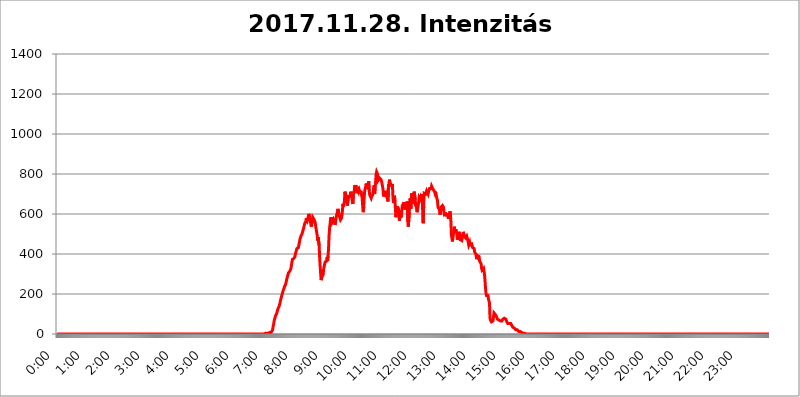
| Category | 2017.11.28. Intenzitás [W/m^2] |
|---|---|
| 0.0 | 0 |
| 0.0006944444444444445 | 0 |
| 0.001388888888888889 | 0 |
| 0.0020833333333333333 | 0 |
| 0.002777777777777778 | 0 |
| 0.003472222222222222 | 0 |
| 0.004166666666666667 | 0 |
| 0.004861111111111111 | 0 |
| 0.005555555555555556 | 0 |
| 0.0062499999999999995 | 0 |
| 0.006944444444444444 | 0 |
| 0.007638888888888889 | 0 |
| 0.008333333333333333 | 0 |
| 0.009027777777777779 | 0 |
| 0.009722222222222222 | 0 |
| 0.010416666666666666 | 0 |
| 0.011111111111111112 | 0 |
| 0.011805555555555555 | 0 |
| 0.012499999999999999 | 0 |
| 0.013194444444444444 | 0 |
| 0.013888888888888888 | 0 |
| 0.014583333333333332 | 0 |
| 0.015277777777777777 | 0 |
| 0.015972222222222224 | 0 |
| 0.016666666666666666 | 0 |
| 0.017361111111111112 | 0 |
| 0.018055555555555557 | 0 |
| 0.01875 | 0 |
| 0.019444444444444445 | 0 |
| 0.02013888888888889 | 0 |
| 0.020833333333333332 | 0 |
| 0.02152777777777778 | 0 |
| 0.022222222222222223 | 0 |
| 0.02291666666666667 | 0 |
| 0.02361111111111111 | 0 |
| 0.024305555555555556 | 0 |
| 0.024999999999999998 | 0 |
| 0.025694444444444447 | 0 |
| 0.02638888888888889 | 0 |
| 0.027083333333333334 | 0 |
| 0.027777777777777776 | 0 |
| 0.02847222222222222 | 0 |
| 0.029166666666666664 | 0 |
| 0.029861111111111113 | 0 |
| 0.030555555555555555 | 0 |
| 0.03125 | 0 |
| 0.03194444444444445 | 0 |
| 0.03263888888888889 | 0 |
| 0.03333333333333333 | 0 |
| 0.034027777777777775 | 0 |
| 0.034722222222222224 | 0 |
| 0.035416666666666666 | 0 |
| 0.036111111111111115 | 0 |
| 0.03680555555555556 | 0 |
| 0.0375 | 0 |
| 0.03819444444444444 | 0 |
| 0.03888888888888889 | 0 |
| 0.03958333333333333 | 0 |
| 0.04027777777777778 | 0 |
| 0.04097222222222222 | 0 |
| 0.041666666666666664 | 0 |
| 0.042361111111111106 | 0 |
| 0.04305555555555556 | 0 |
| 0.043750000000000004 | 0 |
| 0.044444444444444446 | 0 |
| 0.04513888888888889 | 0 |
| 0.04583333333333334 | 0 |
| 0.04652777777777778 | 0 |
| 0.04722222222222222 | 0 |
| 0.04791666666666666 | 0 |
| 0.04861111111111111 | 0 |
| 0.049305555555555554 | 0 |
| 0.049999999999999996 | 0 |
| 0.05069444444444445 | 0 |
| 0.051388888888888894 | 0 |
| 0.052083333333333336 | 0 |
| 0.05277777777777778 | 0 |
| 0.05347222222222222 | 0 |
| 0.05416666666666667 | 0 |
| 0.05486111111111111 | 0 |
| 0.05555555555555555 | 0 |
| 0.05625 | 0 |
| 0.05694444444444444 | 0 |
| 0.057638888888888885 | 0 |
| 0.05833333333333333 | 0 |
| 0.05902777777777778 | 0 |
| 0.059722222222222225 | 0 |
| 0.06041666666666667 | 0 |
| 0.061111111111111116 | 0 |
| 0.06180555555555556 | 0 |
| 0.0625 | 0 |
| 0.06319444444444444 | 0 |
| 0.06388888888888888 | 0 |
| 0.06458333333333334 | 0 |
| 0.06527777777777778 | 0 |
| 0.06597222222222222 | 0 |
| 0.06666666666666667 | 0 |
| 0.06736111111111111 | 0 |
| 0.06805555555555555 | 0 |
| 0.06874999999999999 | 0 |
| 0.06944444444444443 | 0 |
| 0.07013888888888889 | 0 |
| 0.07083333333333333 | 0 |
| 0.07152777777777779 | 0 |
| 0.07222222222222223 | 0 |
| 0.07291666666666667 | 0 |
| 0.07361111111111111 | 0 |
| 0.07430555555555556 | 0 |
| 0.075 | 0 |
| 0.07569444444444444 | 0 |
| 0.0763888888888889 | 0 |
| 0.07708333333333334 | 0 |
| 0.07777777777777778 | 0 |
| 0.07847222222222222 | 0 |
| 0.07916666666666666 | 0 |
| 0.0798611111111111 | 0 |
| 0.08055555555555556 | 0 |
| 0.08125 | 0 |
| 0.08194444444444444 | 0 |
| 0.08263888888888889 | 0 |
| 0.08333333333333333 | 0 |
| 0.08402777777777777 | 0 |
| 0.08472222222222221 | 0 |
| 0.08541666666666665 | 0 |
| 0.08611111111111112 | 0 |
| 0.08680555555555557 | 0 |
| 0.08750000000000001 | 0 |
| 0.08819444444444445 | 0 |
| 0.08888888888888889 | 0 |
| 0.08958333333333333 | 0 |
| 0.09027777777777778 | 0 |
| 0.09097222222222222 | 0 |
| 0.09166666666666667 | 0 |
| 0.09236111111111112 | 0 |
| 0.09305555555555556 | 0 |
| 0.09375 | 0 |
| 0.09444444444444444 | 0 |
| 0.09513888888888888 | 0 |
| 0.09583333333333333 | 0 |
| 0.09652777777777777 | 0 |
| 0.09722222222222222 | 0 |
| 0.09791666666666667 | 0 |
| 0.09861111111111111 | 0 |
| 0.09930555555555555 | 0 |
| 0.09999999999999999 | 0 |
| 0.10069444444444443 | 0 |
| 0.1013888888888889 | 0 |
| 0.10208333333333335 | 0 |
| 0.10277777777777779 | 0 |
| 0.10347222222222223 | 0 |
| 0.10416666666666667 | 0 |
| 0.10486111111111111 | 0 |
| 0.10555555555555556 | 0 |
| 0.10625 | 0 |
| 0.10694444444444444 | 0 |
| 0.1076388888888889 | 0 |
| 0.10833333333333334 | 0 |
| 0.10902777777777778 | 0 |
| 0.10972222222222222 | 0 |
| 0.1111111111111111 | 0 |
| 0.11180555555555556 | 0 |
| 0.11180555555555556 | 0 |
| 0.1125 | 0 |
| 0.11319444444444444 | 0 |
| 0.11388888888888889 | 0 |
| 0.11458333333333333 | 0 |
| 0.11527777777777777 | 0 |
| 0.11597222222222221 | 0 |
| 0.11666666666666665 | 0 |
| 0.1173611111111111 | 0 |
| 0.11805555555555557 | 0 |
| 0.11944444444444445 | 0 |
| 0.12013888888888889 | 0 |
| 0.12083333333333333 | 0 |
| 0.12152777777777778 | 0 |
| 0.12222222222222223 | 0 |
| 0.12291666666666667 | 0 |
| 0.12291666666666667 | 0 |
| 0.12361111111111112 | 0 |
| 0.12430555555555556 | 0 |
| 0.125 | 0 |
| 0.12569444444444444 | 0 |
| 0.12638888888888888 | 0 |
| 0.12708333333333333 | 0 |
| 0.16875 | 0 |
| 0.12847222222222224 | 0 |
| 0.12916666666666668 | 0 |
| 0.12986111111111112 | 0 |
| 0.13055555555555556 | 0 |
| 0.13125 | 0 |
| 0.13194444444444445 | 0 |
| 0.1326388888888889 | 0 |
| 0.13333333333333333 | 0 |
| 0.13402777777777777 | 0 |
| 0.13402777777777777 | 0 |
| 0.13472222222222222 | 0 |
| 0.13541666666666666 | 0 |
| 0.1361111111111111 | 0 |
| 0.13749999999999998 | 0 |
| 0.13819444444444443 | 0 |
| 0.1388888888888889 | 0 |
| 0.13958333333333334 | 0 |
| 0.14027777777777778 | 0 |
| 0.14097222222222222 | 0 |
| 0.14166666666666666 | 0 |
| 0.1423611111111111 | 0 |
| 0.14305555555555557 | 0 |
| 0.14375000000000002 | 0 |
| 0.14444444444444446 | 0 |
| 0.1451388888888889 | 0 |
| 0.1451388888888889 | 0 |
| 0.14652777777777778 | 0 |
| 0.14722222222222223 | 0 |
| 0.14791666666666667 | 0 |
| 0.1486111111111111 | 0 |
| 0.14930555555555555 | 0 |
| 0.15 | 0 |
| 0.15069444444444444 | 0 |
| 0.15138888888888888 | 0 |
| 0.15208333333333332 | 0 |
| 0.15277777777777776 | 0 |
| 0.15347222222222223 | 0 |
| 0.15416666666666667 | 0 |
| 0.15486111111111112 | 0 |
| 0.15555555555555556 | 0 |
| 0.15625 | 0 |
| 0.15694444444444444 | 0 |
| 0.15763888888888888 | 0 |
| 0.15833333333333333 | 0 |
| 0.15902777777777777 | 0 |
| 0.15972222222222224 | 0 |
| 0.16041666666666668 | 0 |
| 0.16111111111111112 | 0 |
| 0.16180555555555556 | 0 |
| 0.1625 | 0 |
| 0.16319444444444445 | 0 |
| 0.1638888888888889 | 0 |
| 0.16458333333333333 | 0 |
| 0.16527777777777777 | 0 |
| 0.16597222222222222 | 0 |
| 0.16666666666666666 | 0 |
| 0.1673611111111111 | 0 |
| 0.16805555555555554 | 0 |
| 0.16874999999999998 | 0 |
| 0.16944444444444443 | 0 |
| 0.17013888888888887 | 0 |
| 0.1708333333333333 | 0 |
| 0.17152777777777775 | 0 |
| 0.17222222222222225 | 0 |
| 0.1729166666666667 | 0 |
| 0.17361111111111113 | 0 |
| 0.17430555555555557 | 0 |
| 0.17500000000000002 | 0 |
| 0.17569444444444446 | 0 |
| 0.1763888888888889 | 0 |
| 0.17708333333333334 | 0 |
| 0.17777777777777778 | 0 |
| 0.17847222222222223 | 0 |
| 0.17916666666666667 | 0 |
| 0.1798611111111111 | 0 |
| 0.18055555555555555 | 0 |
| 0.18125 | 0 |
| 0.18194444444444444 | 0 |
| 0.1826388888888889 | 0 |
| 0.18333333333333335 | 0 |
| 0.1840277777777778 | 0 |
| 0.18472222222222223 | 0 |
| 0.18541666666666667 | 0 |
| 0.18611111111111112 | 0 |
| 0.18680555555555556 | 0 |
| 0.1875 | 0 |
| 0.18819444444444444 | 0 |
| 0.18888888888888888 | 0 |
| 0.18958333333333333 | 0 |
| 0.19027777777777777 | 0 |
| 0.1909722222222222 | 0 |
| 0.19166666666666665 | 0 |
| 0.19236111111111112 | 0 |
| 0.19305555555555554 | 0 |
| 0.19375 | 0 |
| 0.19444444444444445 | 0 |
| 0.1951388888888889 | 0 |
| 0.19583333333333333 | 0 |
| 0.19652777777777777 | 0 |
| 0.19722222222222222 | 0 |
| 0.19791666666666666 | 0 |
| 0.1986111111111111 | 0 |
| 0.19930555555555554 | 0 |
| 0.19999999999999998 | 0 |
| 0.20069444444444443 | 0 |
| 0.20138888888888887 | 0 |
| 0.2020833333333333 | 0 |
| 0.2027777777777778 | 0 |
| 0.2034722222222222 | 0 |
| 0.2041666666666667 | 0 |
| 0.20486111111111113 | 0 |
| 0.20555555555555557 | 0 |
| 0.20625000000000002 | 0 |
| 0.20694444444444446 | 0 |
| 0.2076388888888889 | 0 |
| 0.20833333333333334 | 0 |
| 0.20902777777777778 | 0 |
| 0.20972222222222223 | 0 |
| 0.21041666666666667 | 0 |
| 0.2111111111111111 | 0 |
| 0.21180555555555555 | 0 |
| 0.2125 | 0 |
| 0.21319444444444444 | 0 |
| 0.2138888888888889 | 0 |
| 0.21458333333333335 | 0 |
| 0.2152777777777778 | 0 |
| 0.21597222222222223 | 0 |
| 0.21666666666666667 | 0 |
| 0.21736111111111112 | 0 |
| 0.21805555555555556 | 0 |
| 0.21875 | 0 |
| 0.21944444444444444 | 0 |
| 0.22013888888888888 | 0 |
| 0.22083333333333333 | 0 |
| 0.22152777777777777 | 0 |
| 0.2222222222222222 | 0 |
| 0.22291666666666665 | 0 |
| 0.2236111111111111 | 0 |
| 0.22430555555555556 | 0 |
| 0.225 | 0 |
| 0.22569444444444445 | 0 |
| 0.2263888888888889 | 0 |
| 0.22708333333333333 | 0 |
| 0.22777777777777777 | 0 |
| 0.22847222222222222 | 0 |
| 0.22916666666666666 | 0 |
| 0.2298611111111111 | 0 |
| 0.23055555555555554 | 0 |
| 0.23124999999999998 | 0 |
| 0.23194444444444443 | 0 |
| 0.23263888888888887 | 0 |
| 0.2333333333333333 | 0 |
| 0.2340277777777778 | 0 |
| 0.2347222222222222 | 0 |
| 0.2354166666666667 | 0 |
| 0.23611111111111113 | 0 |
| 0.23680555555555557 | 0 |
| 0.23750000000000002 | 0 |
| 0.23819444444444446 | 0 |
| 0.2388888888888889 | 0 |
| 0.23958333333333334 | 0 |
| 0.24027777777777778 | 0 |
| 0.24097222222222223 | 0 |
| 0.24166666666666667 | 0 |
| 0.2423611111111111 | 0 |
| 0.24305555555555555 | 0 |
| 0.24375 | 0 |
| 0.24444444444444446 | 0 |
| 0.24513888888888888 | 0 |
| 0.24583333333333335 | 0 |
| 0.2465277777777778 | 0 |
| 0.24722222222222223 | 0 |
| 0.24791666666666667 | 0 |
| 0.24861111111111112 | 0 |
| 0.24930555555555556 | 0 |
| 0.25 | 0 |
| 0.25069444444444444 | 0 |
| 0.2513888888888889 | 0 |
| 0.2520833333333333 | 0 |
| 0.25277777777777777 | 0 |
| 0.2534722222222222 | 0 |
| 0.25416666666666665 | 0 |
| 0.2548611111111111 | 0 |
| 0.2555555555555556 | 0 |
| 0.25625000000000003 | 0 |
| 0.2569444444444445 | 0 |
| 0.2576388888888889 | 0 |
| 0.25833333333333336 | 0 |
| 0.2590277777777778 | 0 |
| 0.25972222222222224 | 0 |
| 0.2604166666666667 | 0 |
| 0.2611111111111111 | 0 |
| 0.26180555555555557 | 0 |
| 0.2625 | 0 |
| 0.26319444444444445 | 0 |
| 0.2638888888888889 | 0 |
| 0.26458333333333334 | 0 |
| 0.2652777777777778 | 0 |
| 0.2659722222222222 | 0 |
| 0.26666666666666666 | 0 |
| 0.2673611111111111 | 0 |
| 0.26805555555555555 | 0 |
| 0.26875 | 0 |
| 0.26944444444444443 | 0 |
| 0.2701388888888889 | 0 |
| 0.2708333333333333 | 0 |
| 0.27152777777777776 | 0 |
| 0.2722222222222222 | 0 |
| 0.27291666666666664 | 0 |
| 0.2736111111111111 | 0 |
| 0.2743055555555555 | 0 |
| 0.27499999999999997 | 0 |
| 0.27569444444444446 | 0 |
| 0.27638888888888885 | 0 |
| 0.27708333333333335 | 0 |
| 0.2777777777777778 | 0 |
| 0.27847222222222223 | 0 |
| 0.2791666666666667 | 0 |
| 0.2798611111111111 | 0 |
| 0.28055555555555556 | 0 |
| 0.28125 | 0 |
| 0.28194444444444444 | 0 |
| 0.2826388888888889 | 0 |
| 0.2833333333333333 | 0 |
| 0.28402777777777777 | 0 |
| 0.2847222222222222 | 0 |
| 0.28541666666666665 | 0 |
| 0.28611111111111115 | 0 |
| 0.28680555555555554 | 0 |
| 0.28750000000000003 | 0 |
| 0.2881944444444445 | 0 |
| 0.2888888888888889 | 0 |
| 0.28958333333333336 | 0 |
| 0.2902777777777778 | 0 |
| 0.29097222222222224 | 3.525 |
| 0.2916666666666667 | 3.525 |
| 0.2923611111111111 | 3.525 |
| 0.29305555555555557 | 3.525 |
| 0.29375 | 3.525 |
| 0.29444444444444445 | 3.525 |
| 0.2951388888888889 | 3.525 |
| 0.29583333333333334 | 3.525 |
| 0.2965277777777778 | 3.525 |
| 0.2972222222222222 | 3.525 |
| 0.29791666666666666 | 7.887 |
| 0.2986111111111111 | 3.525 |
| 0.29930555555555555 | 7.887 |
| 0.3 | 7.887 |
| 0.30069444444444443 | 7.887 |
| 0.3013888888888889 | 12.257 |
| 0.3020833333333333 | 21.024 |
| 0.30277777777777776 | 38.653 |
| 0.3034722222222222 | 47.511 |
| 0.30416666666666664 | 65.31 |
| 0.3048611111111111 | 74.246 |
| 0.3055555555555555 | 83.205 |
| 0.30624999999999997 | 92.184 |
| 0.3069444444444444 | 96.682 |
| 0.3076388888888889 | 101.184 |
| 0.30833333333333335 | 110.201 |
| 0.3090277777777778 | 119.235 |
| 0.30972222222222223 | 128.284 |
| 0.3104166666666667 | 132.814 |
| 0.3111111111111111 | 137.347 |
| 0.31180555555555556 | 146.423 |
| 0.3125 | 155.509 |
| 0.31319444444444444 | 169.156 |
| 0.3138888888888889 | 178.264 |
| 0.3145833333333333 | 187.378 |
| 0.31527777777777777 | 191.937 |
| 0.3159722222222222 | 205.62 |
| 0.31666666666666665 | 214.746 |
| 0.31736111111111115 | 219.309 |
| 0.31805555555555554 | 228.436 |
| 0.31875000000000003 | 237.564 |
| 0.3194444444444445 | 242.127 |
| 0.3201388888888889 | 246.689 |
| 0.32083333333333336 | 255.813 |
| 0.3215277777777778 | 269.49 |
| 0.32222222222222224 | 278.603 |
| 0.3229166666666667 | 287.709 |
| 0.3236111111111111 | 296.808 |
| 0.32430555555555557 | 305.898 |
| 0.325 | 301.354 |
| 0.32569444444444445 | 305.898 |
| 0.3263888888888889 | 314.98 |
| 0.32708333333333334 | 310.44 |
| 0.3277777777777778 | 328.584 |
| 0.3284722222222222 | 328.584 |
| 0.32916666666666666 | 360.221 |
| 0.3298611111111111 | 373.729 |
| 0.33055555555555555 | 378.224 |
| 0.33125 | 378.224 |
| 0.33194444444444443 | 378.224 |
| 0.3326388888888889 | 378.224 |
| 0.3333333333333333 | 387.202 |
| 0.3340277777777778 | 400.638 |
| 0.3347222222222222 | 405.108 |
| 0.3354166666666667 | 418.492 |
| 0.3361111111111111 | 427.39 |
| 0.3368055555555556 | 422.943 |
| 0.33749999999999997 | 422.943 |
| 0.33819444444444446 | 431.833 |
| 0.33888888888888885 | 445.129 |
| 0.33958333333333335 | 440.702 |
| 0.34027777777777773 | 471.582 |
| 0.34097222222222223 | 480.356 |
| 0.3416666666666666 | 489.108 |
| 0.3423611111111111 | 493.475 |
| 0.3430555555555555 | 497.836 |
| 0.34375 | 506.542 |
| 0.3444444444444445 | 506.542 |
| 0.3451388888888889 | 523.88 |
| 0.3458333333333334 | 532.513 |
| 0.34652777777777777 | 545.416 |
| 0.34722222222222227 | 553.986 |
| 0.34791666666666665 | 553.986 |
| 0.34861111111111115 | 562.53 |
| 0.34930555555555554 | 579.542 |
| 0.35000000000000003 | 579.542 |
| 0.3506944444444444 | 566.793 |
| 0.3513888888888889 | 575.299 |
| 0.3520833333333333 | 579.542 |
| 0.3527777777777778 | 600.661 |
| 0.3534722222222222 | 596.45 |
| 0.3541666666666667 | 583.779 |
| 0.3548611111111111 | 566.793 |
| 0.35555555555555557 | 571.049 |
| 0.35625 | 536.82 |
| 0.35694444444444445 | 545.416 |
| 0.3576388888888889 | 566.793 |
| 0.35833333333333334 | 583.779 |
| 0.3590277777777778 | 588.009 |
| 0.3597222222222222 | 575.299 |
| 0.36041666666666666 | 579.542 |
| 0.3611111111111111 | 575.299 |
| 0.36180555555555555 | 558.261 |
| 0.3625 | 536.82 |
| 0.36319444444444443 | 523.88 |
| 0.3638888888888889 | 523.88 |
| 0.3645833333333333 | 493.475 |
| 0.3652777777777778 | 467.187 |
| 0.3659722222222222 | 484.735 |
| 0.3666666666666667 | 484.735 |
| 0.3673611111111111 | 440.702 |
| 0.3680555555555556 | 378.224 |
| 0.36874999999999997 | 337.639 |
| 0.36944444444444446 | 301.354 |
| 0.37013888888888885 | 269.49 |
| 0.37083333333333335 | 278.603 |
| 0.37152777777777773 | 287.709 |
| 0.37222222222222223 | 283.156 |
| 0.3729166666666666 | 296.808 |
| 0.3736111111111111 | 324.052 |
| 0.3743055555555555 | 337.639 |
| 0.375 | 333.113 |
| 0.3756944444444445 | 360.221 |
| 0.3763888888888889 | 360.221 |
| 0.3770833333333334 | 355.712 |
| 0.37777777777777777 | 364.728 |
| 0.37847222222222227 | 382.715 |
| 0.37916666666666665 | 364.728 |
| 0.37986111111111115 | 391.685 |
| 0.38055555555555554 | 431.833 |
| 0.38125000000000003 | 493.475 |
| 0.3819444444444444 | 528.2 |
| 0.3826388888888889 | 549.704 |
| 0.3833333333333333 | 575.299 |
| 0.3840277777777778 | 583.779 |
| 0.3847222222222222 | 583.779 |
| 0.3854166666666667 | 558.261 |
| 0.3861111111111111 | 553.986 |
| 0.38680555555555557 | 562.53 |
| 0.3875 | 575.299 |
| 0.38819444444444445 | 571.049 |
| 0.3888888888888889 | 566.793 |
| 0.38958333333333334 | 545.416 |
| 0.3902777777777778 | 558.261 |
| 0.3909722222222222 | 575.299 |
| 0.39166666666666666 | 592.233 |
| 0.3923611111111111 | 600.661 |
| 0.39305555555555555 | 613.252 |
| 0.39375 | 625.784 |
| 0.39444444444444443 | 621.613 |
| 0.3951388888888889 | 596.45 |
| 0.3958333333333333 | 588.009 |
| 0.3965277777777778 | 588.009 |
| 0.3972222222222222 | 571.049 |
| 0.3979166666666667 | 566.793 |
| 0.3986111111111111 | 579.542 |
| 0.3993055555555556 | 592.233 |
| 0.39999999999999997 | 617.436 |
| 0.40069444444444446 | 650.667 |
| 0.40138888888888885 | 638.256 |
| 0.40208333333333335 | 650.667 |
| 0.40277777777777773 | 663.019 |
| 0.40347222222222223 | 711.832 |
| 0.4041666666666666 | 707.8 |
| 0.4048611111111111 | 691.608 |
| 0.4055555555555555 | 671.22 |
| 0.40625 | 654.791 |
| 0.4069444444444445 | 642.4 |
| 0.4076388888888889 | 642.4 |
| 0.4083333333333334 | 687.544 |
| 0.40902777777777777 | 683.473 |
| 0.40972222222222227 | 683.473 |
| 0.41041666666666665 | 687.544 |
| 0.41111111111111115 | 699.717 |
| 0.41180555555555554 | 711.832 |
| 0.41250000000000003 | 699.717 |
| 0.4131944444444444 | 683.473 |
| 0.4138888888888889 | 658.909 |
| 0.4145833333333333 | 650.667 |
| 0.4152777777777778 | 691.608 |
| 0.4159722222222222 | 687.544 |
| 0.4166666666666667 | 719.877 |
| 0.4173611111111111 | 743.859 |
| 0.41805555555555557 | 735.89 |
| 0.41875 | 743.859 |
| 0.41944444444444445 | 731.896 |
| 0.4201388888888889 | 703.762 |
| 0.42083333333333334 | 699.717 |
| 0.4215277777777778 | 699.717 |
| 0.4222222222222222 | 719.877 |
| 0.42291666666666666 | 711.832 |
| 0.4236111111111111 | 719.877 |
| 0.42430555555555555 | 715.858 |
| 0.425 | 703.762 |
| 0.42569444444444443 | 715.858 |
| 0.4263888888888889 | 711.832 |
| 0.4270833333333333 | 691.608 |
| 0.4277777777777778 | 675.311 |
| 0.4284722222222222 | 634.105 |
| 0.4291666666666667 | 609.062 |
| 0.4298611111111111 | 634.105 |
| 0.4305555555555556 | 687.544 |
| 0.43124999999999997 | 715.858 |
| 0.43194444444444446 | 727.896 |
| 0.43263888888888885 | 735.89 |
| 0.43333333333333335 | 751.803 |
| 0.43402777777777773 | 735.89 |
| 0.43472222222222223 | 751.803 |
| 0.4354166666666666 | 735.89 |
| 0.4361111111111111 | 723.889 |
| 0.4368055555555555 | 763.674 |
| 0.4375 | 719.877 |
| 0.4381944444444445 | 695.666 |
| 0.4388888888888889 | 691.608 |
| 0.4395833333333334 | 699.717 |
| 0.44027777777777777 | 679.395 |
| 0.44097222222222227 | 687.544 |
| 0.44166666666666665 | 691.608 |
| 0.44236111111111115 | 695.666 |
| 0.44305555555555554 | 695.666 |
| 0.44375000000000003 | 727.896 |
| 0.4444444444444444 | 743.859 |
| 0.4451388888888889 | 699.717 |
| 0.4458333333333333 | 731.896 |
| 0.4465277777777778 | 759.723 |
| 0.4472222222222222 | 798.974 |
| 0.4479166666666667 | 810.641 |
| 0.4486111111111111 | 814.519 |
| 0.44930555555555557 | 798.974 |
| 0.45 | 767.62 |
| 0.45069444444444445 | 763.674 |
| 0.4513888888888889 | 771.559 |
| 0.45208333333333334 | 779.42 |
| 0.4527777777777778 | 775.492 |
| 0.4534722222222222 | 779.42 |
| 0.45416666666666666 | 771.559 |
| 0.4548611111111111 | 763.674 |
| 0.45555555555555555 | 763.674 |
| 0.45625 | 759.723 |
| 0.45694444444444443 | 723.889 |
| 0.4576388888888889 | 687.544 |
| 0.4583333333333333 | 687.544 |
| 0.4590277777777778 | 703.762 |
| 0.4597222222222222 | 715.858 |
| 0.4604166666666667 | 703.762 |
| 0.4611111111111111 | 691.608 |
| 0.4618055555555556 | 687.544 |
| 0.46249999999999997 | 683.473 |
| 0.46319444444444446 | 675.311 |
| 0.46388888888888885 | 663.019 |
| 0.46458333333333335 | 747.834 |
| 0.46527777777777773 | 735.89 |
| 0.46597222222222223 | 771.559 |
| 0.4666666666666666 | 759.723 |
| 0.4673611111111111 | 759.723 |
| 0.4680555555555555 | 743.859 |
| 0.46875 | 743.859 |
| 0.4694444444444445 | 743.859 |
| 0.4701388888888889 | 743.859 |
| 0.4708333333333334 | 683.473 |
| 0.47152777777777777 | 654.791 |
| 0.47222222222222227 | 667.123 |
| 0.47291666666666665 | 691.608 |
| 0.47361111111111115 | 667.123 |
| 0.47430555555555554 | 667.123 |
| 0.47500000000000003 | 583.779 |
| 0.4756944444444444 | 604.864 |
| 0.4763888888888889 | 617.436 |
| 0.4770833333333333 | 638.256 |
| 0.4777777777777778 | 638.256 |
| 0.4784722222222222 | 638.256 |
| 0.4791666666666667 | 617.436 |
| 0.4798611111111111 | 566.793 |
| 0.48055555555555557 | 583.779 |
| 0.48125 | 617.436 |
| 0.48194444444444445 | 583.779 |
| 0.4826388888888889 | 592.233 |
| 0.48333333333333334 | 617.436 |
| 0.4840277777777778 | 646.537 |
| 0.4847222222222222 | 634.105 |
| 0.48541666666666666 | 650.667 |
| 0.4861111111111111 | 658.909 |
| 0.48680555555555555 | 642.4 |
| 0.4875 | 621.613 |
| 0.48819444444444443 | 650.667 |
| 0.4888888888888889 | 634.105 |
| 0.4895833333333333 | 642.4 |
| 0.4902777777777778 | 642.4 |
| 0.4909722222222222 | 663.019 |
| 0.4916666666666667 | 562.53 |
| 0.4923611111111111 | 536.82 |
| 0.4930555555555556 | 541.121 |
| 0.49374999999999997 | 609.062 |
| 0.49444444444444446 | 663.019 |
| 0.49513888888888885 | 679.395 |
| 0.49583333333333335 | 625.784 |
| 0.49652777777777773 | 663.019 |
| 0.49722222222222223 | 703.762 |
| 0.4979166666666666 | 667.123 |
| 0.4986111111111111 | 650.667 |
| 0.4993055555555555 | 658.909 |
| 0.5 | 695.666 |
| 0.5006944444444444 | 711.832 |
| 0.5013888888888889 | 707.8 |
| 0.5020833333333333 | 671.22 |
| 0.5027777777777778 | 638.256 |
| 0.5034722222222222 | 650.667 |
| 0.5041666666666667 | 646.537 |
| 0.5048611111111111 | 609.062 |
| 0.5055555555555555 | 625.784 |
| 0.50625 | 625.784 |
| 0.5069444444444444 | 658.909 |
| 0.5076388888888889 | 683.473 |
| 0.5083333333333333 | 687.544 |
| 0.5090277777777777 | 675.311 |
| 0.5097222222222222 | 683.473 |
| 0.5104166666666666 | 675.311 |
| 0.5111111111111112 | 699.717 |
| 0.5118055555555555 | 679.395 |
| 0.5125000000000001 | 675.311 |
| 0.5131944444444444 | 553.986 |
| 0.513888888888889 | 634.105 |
| 0.5145833333333333 | 703.762 |
| 0.5152777777777778 | 699.717 |
| 0.5159722222222222 | 699.717 |
| 0.5166666666666667 | 699.717 |
| 0.517361111111111 | 703.762 |
| 0.5180555555555556 | 715.858 |
| 0.5187499999999999 | 715.858 |
| 0.5194444444444445 | 711.832 |
| 0.5201388888888888 | 699.717 |
| 0.5208333333333334 | 711.832 |
| 0.5215277777777778 | 711.832 |
| 0.5222222222222223 | 727.896 |
| 0.5229166666666667 | 731.896 |
| 0.5236111111111111 | 727.896 |
| 0.5243055555555556 | 727.896 |
| 0.525 | 739.877 |
| 0.5256944444444445 | 735.89 |
| 0.5263888888888889 | 739.877 |
| 0.5270833333333333 | 723.889 |
| 0.5277777777777778 | 719.877 |
| 0.5284722222222222 | 723.889 |
| 0.5291666666666667 | 711.832 |
| 0.5298611111111111 | 703.762 |
| 0.5305555555555556 | 711.832 |
| 0.53125 | 695.666 |
| 0.5319444444444444 | 687.544 |
| 0.5326388888888889 | 675.311 |
| 0.5333333333333333 | 667.123 |
| 0.5340277777777778 | 634.105 |
| 0.5347222222222222 | 634.105 |
| 0.5354166666666667 | 638.256 |
| 0.5361111111111111 | 621.613 |
| 0.5368055555555555 | 596.45 |
| 0.5375 | 609.062 |
| 0.5381944444444444 | 634.105 |
| 0.5388888888888889 | 634.105 |
| 0.5395833333333333 | 634.105 |
| 0.5402777777777777 | 642.4 |
| 0.5409722222222222 | 638.256 |
| 0.5416666666666666 | 634.105 |
| 0.5423611111111112 | 609.062 |
| 0.5430555555555555 | 596.45 |
| 0.5437500000000001 | 600.661 |
| 0.5444444444444444 | 596.45 |
| 0.545138888888889 | 600.661 |
| 0.5458333333333333 | 596.45 |
| 0.5465277777777778 | 588.009 |
| 0.5472222222222222 | 604.864 |
| 0.5479166666666667 | 592.233 |
| 0.548611111111111 | 575.299 |
| 0.5493055555555556 | 583.779 |
| 0.5499999999999999 | 592.233 |
| 0.5506944444444445 | 613.252 |
| 0.5513888888888888 | 600.661 |
| 0.5520833333333334 | 566.793 |
| 0.5527777777777778 | 497.836 |
| 0.5534722222222223 | 502.192 |
| 0.5541666666666667 | 462.786 |
| 0.5548611111111111 | 480.356 |
| 0.5555555555555556 | 484.735 |
| 0.55625 | 515.223 |
| 0.5569444444444445 | 536.82 |
| 0.5576388888888889 | 506.542 |
| 0.5583333333333333 | 515.223 |
| 0.5590277777777778 | 523.88 |
| 0.5597222222222222 | 510.885 |
| 0.5604166666666667 | 502.192 |
| 0.5611111111111111 | 471.582 |
| 0.5618055555555556 | 467.187 |
| 0.5625 | 484.735 |
| 0.5631944444444444 | 475.972 |
| 0.5638888888888889 | 510.885 |
| 0.5645833333333333 | 506.542 |
| 0.5652777777777778 | 471.582 |
| 0.5659722222222222 | 471.582 |
| 0.5666666666666667 | 475.972 |
| 0.5673611111111111 | 467.187 |
| 0.5680555555555555 | 480.356 |
| 0.56875 | 484.735 |
| 0.5694444444444444 | 510.885 |
| 0.5701388888888889 | 510.885 |
| 0.5708333333333333 | 489.108 |
| 0.5715277777777777 | 484.735 |
| 0.5722222222222222 | 484.735 |
| 0.5729166666666666 | 480.356 |
| 0.5736111111111112 | 484.735 |
| 0.5743055555555555 | 489.108 |
| 0.5750000000000001 | 480.356 |
| 0.5756944444444444 | 471.582 |
| 0.576388888888889 | 458.38 |
| 0.5770833333333333 | 445.129 |
| 0.5777777777777778 | 449.551 |
| 0.5784722222222222 | 458.38 |
| 0.5791666666666667 | 445.129 |
| 0.579861111111111 | 440.702 |
| 0.5805555555555556 | 449.551 |
| 0.5812499999999999 | 449.551 |
| 0.5819444444444445 | 449.551 |
| 0.5826388888888888 | 431.833 |
| 0.5833333333333334 | 436.27 |
| 0.5840277777777778 | 436.27 |
| 0.5847222222222223 | 427.39 |
| 0.5854166666666667 | 409.574 |
| 0.5861111111111111 | 414.035 |
| 0.5868055555555556 | 409.574 |
| 0.5875 | 396.164 |
| 0.5881944444444445 | 373.729 |
| 0.5888888888888889 | 378.224 |
| 0.5895833333333333 | 391.685 |
| 0.5902777777777778 | 387.202 |
| 0.5909722222222222 | 387.202 |
| 0.5916666666666667 | 387.202 |
| 0.5923611111111111 | 364.728 |
| 0.5930555555555556 | 360.221 |
| 0.59375 | 364.728 |
| 0.5944444444444444 | 351.198 |
| 0.5951388888888889 | 328.584 |
| 0.5958333333333333 | 319.517 |
| 0.5965277777777778 | 319.517 |
| 0.5972222222222222 | 314.98 |
| 0.5979166666666667 | 328.584 |
| 0.5986111111111111 | 324.052 |
| 0.5993055555555555 | 296.808 |
| 0.6 | 264.932 |
| 0.6006944444444444 | 228.436 |
| 0.6013888888888889 | 201.058 |
| 0.6020833333333333 | 191.937 |
| 0.6027777777777777 | 187.378 |
| 0.6034722222222222 | 196.497 |
| 0.6041666666666666 | 191.937 |
| 0.6048611111111112 | 173.709 |
| 0.6055555555555555 | 169.156 |
| 0.6062500000000001 | 155.509 |
| 0.6069444444444444 | 78.722 |
| 0.607638888888889 | 69.775 |
| 0.6083333333333333 | 65.31 |
| 0.6090277777777778 | 60.85 |
| 0.6097222222222222 | 60.85 |
| 0.6104166666666667 | 60.85 |
| 0.611111111111111 | 65.31 |
| 0.6118055555555556 | 83.205 |
| 0.6124999999999999 | 105.69 |
| 0.6131944444444445 | 101.184 |
| 0.6138888888888888 | 101.184 |
| 0.6145833333333334 | 96.682 |
| 0.6152777777777778 | 92.184 |
| 0.6159722222222223 | 87.692 |
| 0.6166666666666667 | 83.205 |
| 0.6173611111111111 | 74.246 |
| 0.6180555555555556 | 69.775 |
| 0.61875 | 69.775 |
| 0.6194444444444445 | 69.775 |
| 0.6201388888888889 | 69.775 |
| 0.6208333333333333 | 65.31 |
| 0.6215277777777778 | 65.31 |
| 0.6222222222222222 | 65.31 |
| 0.6229166666666667 | 65.31 |
| 0.6236111111111111 | 65.31 |
| 0.6243055555555556 | 69.775 |
| 0.625 | 74.246 |
| 0.6256944444444444 | 74.246 |
| 0.6263888888888889 | 78.722 |
| 0.6270833333333333 | 78.722 |
| 0.6277777777777778 | 74.246 |
| 0.6284722222222222 | 74.246 |
| 0.6291666666666667 | 74.246 |
| 0.6298611111111111 | 69.775 |
| 0.6305555555555555 | 60.85 |
| 0.63125 | 56.398 |
| 0.6319444444444444 | 51.951 |
| 0.6326388888888889 | 47.511 |
| 0.6333333333333333 | 47.511 |
| 0.6340277777777777 | 51.951 |
| 0.6347222222222222 | 51.951 |
| 0.6354166666666666 | 56.398 |
| 0.6361111111111112 | 51.951 |
| 0.6368055555555555 | 47.511 |
| 0.6375000000000001 | 43.079 |
| 0.6381944444444444 | 38.653 |
| 0.638888888888889 | 34.234 |
| 0.6395833333333333 | 34.234 |
| 0.6402777777777778 | 29.823 |
| 0.6409722222222222 | 29.823 |
| 0.6416666666666667 | 29.823 |
| 0.642361111111111 | 25.419 |
| 0.6430555555555556 | 21.024 |
| 0.6437499999999999 | 21.024 |
| 0.6444444444444445 | 21.024 |
| 0.6451388888888888 | 21.024 |
| 0.6458333333333334 | 16.636 |
| 0.6465277777777778 | 16.636 |
| 0.6472222222222223 | 12.257 |
| 0.6479166666666667 | 12.257 |
| 0.6486111111111111 | 12.257 |
| 0.6493055555555556 | 12.257 |
| 0.65 | 12.257 |
| 0.6506944444444445 | 7.887 |
| 0.6513888888888889 | 7.887 |
| 0.6520833333333333 | 7.887 |
| 0.6527777777777778 | 7.887 |
| 0.6534722222222222 | 3.525 |
| 0.6541666666666667 | 3.525 |
| 0.6548611111111111 | 3.525 |
| 0.6555555555555556 | 3.525 |
| 0.65625 | 3.525 |
| 0.6569444444444444 | 3.525 |
| 0.6576388888888889 | 0 |
| 0.6583333333333333 | 0 |
| 0.6590277777777778 | 0 |
| 0.6597222222222222 | 0 |
| 0.6604166666666667 | 0 |
| 0.6611111111111111 | 0 |
| 0.6618055555555555 | 0 |
| 0.6625 | 0 |
| 0.6631944444444444 | 0 |
| 0.6638888888888889 | 0 |
| 0.6645833333333333 | 0 |
| 0.6652777777777777 | 0 |
| 0.6659722222222222 | 0 |
| 0.6666666666666666 | 0 |
| 0.6673611111111111 | 0 |
| 0.6680555555555556 | 0 |
| 0.6687500000000001 | 0 |
| 0.6694444444444444 | 0 |
| 0.6701388888888888 | 0 |
| 0.6708333333333334 | 0 |
| 0.6715277777777778 | 0 |
| 0.6722222222222222 | 0 |
| 0.6729166666666666 | 0 |
| 0.6736111111111112 | 0 |
| 0.6743055555555556 | 0 |
| 0.6749999999999999 | 0 |
| 0.6756944444444444 | 0 |
| 0.6763888888888889 | 0 |
| 0.6770833333333334 | 0 |
| 0.6777777777777777 | 0 |
| 0.6784722222222223 | 0 |
| 0.6791666666666667 | 0 |
| 0.6798611111111111 | 0 |
| 0.6805555555555555 | 0 |
| 0.68125 | 0 |
| 0.6819444444444445 | 0 |
| 0.6826388888888889 | 0 |
| 0.6833333333333332 | 0 |
| 0.6840277777777778 | 0 |
| 0.6847222222222222 | 0 |
| 0.6854166666666667 | 0 |
| 0.686111111111111 | 0 |
| 0.6868055555555556 | 0 |
| 0.6875 | 0 |
| 0.6881944444444444 | 0 |
| 0.688888888888889 | 0 |
| 0.6895833333333333 | 0 |
| 0.6902777777777778 | 0 |
| 0.6909722222222222 | 0 |
| 0.6916666666666668 | 0 |
| 0.6923611111111111 | 0 |
| 0.6930555555555555 | 0 |
| 0.69375 | 0 |
| 0.6944444444444445 | 0 |
| 0.6951388888888889 | 0 |
| 0.6958333333333333 | 0 |
| 0.6965277777777777 | 0 |
| 0.6972222222222223 | 0 |
| 0.6979166666666666 | 0 |
| 0.6986111111111111 | 0 |
| 0.6993055555555556 | 0 |
| 0.7000000000000001 | 0 |
| 0.7006944444444444 | 0 |
| 0.7013888888888888 | 0 |
| 0.7020833333333334 | 0 |
| 0.7027777777777778 | 0 |
| 0.7034722222222222 | 0 |
| 0.7041666666666666 | 0 |
| 0.7048611111111112 | 0 |
| 0.7055555555555556 | 0 |
| 0.7062499999999999 | 0 |
| 0.7069444444444444 | 0 |
| 0.7076388888888889 | 0 |
| 0.7083333333333334 | 0 |
| 0.7090277777777777 | 0 |
| 0.7097222222222223 | 0 |
| 0.7104166666666667 | 0 |
| 0.7111111111111111 | 0 |
| 0.7118055555555555 | 0 |
| 0.7125 | 0 |
| 0.7131944444444445 | 0 |
| 0.7138888888888889 | 0 |
| 0.7145833333333332 | 0 |
| 0.7152777777777778 | 0 |
| 0.7159722222222222 | 0 |
| 0.7166666666666667 | 0 |
| 0.717361111111111 | 0 |
| 0.7180555555555556 | 0 |
| 0.71875 | 0 |
| 0.7194444444444444 | 0 |
| 0.720138888888889 | 0 |
| 0.7208333333333333 | 0 |
| 0.7215277777777778 | 0 |
| 0.7222222222222222 | 0 |
| 0.7229166666666668 | 0 |
| 0.7236111111111111 | 0 |
| 0.7243055555555555 | 0 |
| 0.725 | 0 |
| 0.7256944444444445 | 0 |
| 0.7263888888888889 | 0 |
| 0.7270833333333333 | 0 |
| 0.7277777777777777 | 0 |
| 0.7284722222222223 | 0 |
| 0.7291666666666666 | 0 |
| 0.7298611111111111 | 0 |
| 0.7305555555555556 | 0 |
| 0.7312500000000001 | 0 |
| 0.7319444444444444 | 0 |
| 0.7326388888888888 | 0 |
| 0.7333333333333334 | 0 |
| 0.7340277777777778 | 0 |
| 0.7347222222222222 | 0 |
| 0.7354166666666666 | 0 |
| 0.7361111111111112 | 0 |
| 0.7368055555555556 | 0 |
| 0.7374999999999999 | 0 |
| 0.7381944444444444 | 0 |
| 0.7388888888888889 | 0 |
| 0.7395833333333334 | 0 |
| 0.7402777777777777 | 0 |
| 0.7409722222222223 | 0 |
| 0.7416666666666667 | 0 |
| 0.7423611111111111 | 0 |
| 0.7430555555555555 | 0 |
| 0.74375 | 0 |
| 0.7444444444444445 | 0 |
| 0.7451388888888889 | 0 |
| 0.7458333333333332 | 0 |
| 0.7465277777777778 | 0 |
| 0.7472222222222222 | 0 |
| 0.7479166666666667 | 0 |
| 0.748611111111111 | 0 |
| 0.7493055555555556 | 0 |
| 0.75 | 0 |
| 0.7506944444444444 | 0 |
| 0.751388888888889 | 0 |
| 0.7520833333333333 | 0 |
| 0.7527777777777778 | 0 |
| 0.7534722222222222 | 0 |
| 0.7541666666666668 | 0 |
| 0.7548611111111111 | 0 |
| 0.7555555555555555 | 0 |
| 0.75625 | 0 |
| 0.7569444444444445 | 0 |
| 0.7576388888888889 | 0 |
| 0.7583333333333333 | 0 |
| 0.7590277777777777 | 0 |
| 0.7597222222222223 | 0 |
| 0.7604166666666666 | 0 |
| 0.7611111111111111 | 0 |
| 0.7618055555555556 | 0 |
| 0.7625000000000001 | 0 |
| 0.7631944444444444 | 0 |
| 0.7638888888888888 | 0 |
| 0.7645833333333334 | 0 |
| 0.7652777777777778 | 0 |
| 0.7659722222222222 | 0 |
| 0.7666666666666666 | 0 |
| 0.7673611111111112 | 0 |
| 0.7680555555555556 | 0 |
| 0.7687499999999999 | 0 |
| 0.7694444444444444 | 0 |
| 0.7701388888888889 | 0 |
| 0.7708333333333334 | 0 |
| 0.7715277777777777 | 0 |
| 0.7722222222222223 | 0 |
| 0.7729166666666667 | 0 |
| 0.7736111111111111 | 0 |
| 0.7743055555555555 | 0 |
| 0.775 | 0 |
| 0.7756944444444445 | 0 |
| 0.7763888888888889 | 0 |
| 0.7770833333333332 | 0 |
| 0.7777777777777778 | 0 |
| 0.7784722222222222 | 0 |
| 0.7791666666666667 | 0 |
| 0.779861111111111 | 0 |
| 0.7805555555555556 | 0 |
| 0.78125 | 0 |
| 0.7819444444444444 | 0 |
| 0.782638888888889 | 0 |
| 0.7833333333333333 | 0 |
| 0.7840277777777778 | 0 |
| 0.7847222222222222 | 0 |
| 0.7854166666666668 | 0 |
| 0.7861111111111111 | 0 |
| 0.7868055555555555 | 0 |
| 0.7875 | 0 |
| 0.7881944444444445 | 0 |
| 0.7888888888888889 | 0 |
| 0.7895833333333333 | 0 |
| 0.7902777777777777 | 0 |
| 0.7909722222222223 | 0 |
| 0.7916666666666666 | 0 |
| 0.7923611111111111 | 0 |
| 0.7930555555555556 | 0 |
| 0.7937500000000001 | 0 |
| 0.7944444444444444 | 0 |
| 0.7951388888888888 | 0 |
| 0.7958333333333334 | 0 |
| 0.7965277777777778 | 0 |
| 0.7972222222222222 | 0 |
| 0.7979166666666666 | 0 |
| 0.7986111111111112 | 0 |
| 0.7993055555555556 | 0 |
| 0.7999999999999999 | 0 |
| 0.8006944444444444 | 0 |
| 0.8013888888888889 | 0 |
| 0.8020833333333334 | 0 |
| 0.8027777777777777 | 0 |
| 0.8034722222222223 | 0 |
| 0.8041666666666667 | 0 |
| 0.8048611111111111 | 0 |
| 0.8055555555555555 | 0 |
| 0.80625 | 0 |
| 0.8069444444444445 | 0 |
| 0.8076388888888889 | 0 |
| 0.8083333333333332 | 0 |
| 0.8090277777777778 | 0 |
| 0.8097222222222222 | 0 |
| 0.8104166666666667 | 0 |
| 0.811111111111111 | 0 |
| 0.8118055555555556 | 0 |
| 0.8125 | 0 |
| 0.8131944444444444 | 0 |
| 0.813888888888889 | 0 |
| 0.8145833333333333 | 0 |
| 0.8152777777777778 | 0 |
| 0.8159722222222222 | 0 |
| 0.8166666666666668 | 0 |
| 0.8173611111111111 | 0 |
| 0.8180555555555555 | 0 |
| 0.81875 | 0 |
| 0.8194444444444445 | 0 |
| 0.8201388888888889 | 0 |
| 0.8208333333333333 | 0 |
| 0.8215277777777777 | 0 |
| 0.8222222222222223 | 0 |
| 0.8229166666666666 | 0 |
| 0.8236111111111111 | 0 |
| 0.8243055555555556 | 0 |
| 0.8250000000000001 | 0 |
| 0.8256944444444444 | 0 |
| 0.8263888888888888 | 0 |
| 0.8270833333333334 | 0 |
| 0.8277777777777778 | 0 |
| 0.8284722222222222 | 0 |
| 0.8291666666666666 | 0 |
| 0.8298611111111112 | 0 |
| 0.8305555555555556 | 0 |
| 0.8312499999999999 | 0 |
| 0.8319444444444444 | 0 |
| 0.8326388888888889 | 0 |
| 0.8333333333333334 | 0 |
| 0.8340277777777777 | 0 |
| 0.8347222222222223 | 0 |
| 0.8354166666666667 | 0 |
| 0.8361111111111111 | 0 |
| 0.8368055555555555 | 0 |
| 0.8375 | 0 |
| 0.8381944444444445 | 0 |
| 0.8388888888888889 | 0 |
| 0.8395833333333332 | 0 |
| 0.8402777777777778 | 0 |
| 0.8409722222222222 | 0 |
| 0.8416666666666667 | 0 |
| 0.842361111111111 | 0 |
| 0.8430555555555556 | 0 |
| 0.84375 | 0 |
| 0.8444444444444444 | 0 |
| 0.845138888888889 | 0 |
| 0.8458333333333333 | 0 |
| 0.8465277777777778 | 0 |
| 0.8472222222222222 | 0 |
| 0.8479166666666668 | 0 |
| 0.8486111111111111 | 0 |
| 0.8493055555555555 | 0 |
| 0.85 | 0 |
| 0.8506944444444445 | 0 |
| 0.8513888888888889 | 0 |
| 0.8520833333333333 | 0 |
| 0.8527777777777777 | 0 |
| 0.8534722222222223 | 0 |
| 0.8541666666666666 | 0 |
| 0.8548611111111111 | 0 |
| 0.8555555555555556 | 0 |
| 0.8562500000000001 | 0 |
| 0.8569444444444444 | 0 |
| 0.8576388888888888 | 0 |
| 0.8583333333333334 | 0 |
| 0.8590277777777778 | 0 |
| 0.8597222222222222 | 0 |
| 0.8604166666666666 | 0 |
| 0.8611111111111112 | 0 |
| 0.8618055555555556 | 0 |
| 0.8624999999999999 | 0 |
| 0.8631944444444444 | 0 |
| 0.8638888888888889 | 0 |
| 0.8645833333333334 | 0 |
| 0.8652777777777777 | 0 |
| 0.8659722222222223 | 0 |
| 0.8666666666666667 | 0 |
| 0.8673611111111111 | 0 |
| 0.8680555555555555 | 0 |
| 0.86875 | 0 |
| 0.8694444444444445 | 0 |
| 0.8701388888888889 | 0 |
| 0.8708333333333332 | 0 |
| 0.8715277777777778 | 0 |
| 0.8722222222222222 | 0 |
| 0.8729166666666667 | 0 |
| 0.873611111111111 | 0 |
| 0.8743055555555556 | 0 |
| 0.875 | 0 |
| 0.8756944444444444 | 0 |
| 0.876388888888889 | 0 |
| 0.8770833333333333 | 0 |
| 0.8777777777777778 | 0 |
| 0.8784722222222222 | 0 |
| 0.8791666666666668 | 0 |
| 0.8798611111111111 | 0 |
| 0.8805555555555555 | 0 |
| 0.88125 | 0 |
| 0.8819444444444445 | 0 |
| 0.8826388888888889 | 0 |
| 0.8833333333333333 | 0 |
| 0.8840277777777777 | 0 |
| 0.8847222222222223 | 0 |
| 0.8854166666666666 | 0 |
| 0.8861111111111111 | 0 |
| 0.8868055555555556 | 0 |
| 0.8875000000000001 | 0 |
| 0.8881944444444444 | 0 |
| 0.8888888888888888 | 0 |
| 0.8895833333333334 | 0 |
| 0.8902777777777778 | 0 |
| 0.8909722222222222 | 0 |
| 0.8916666666666666 | 0 |
| 0.8923611111111112 | 0 |
| 0.8930555555555556 | 0 |
| 0.8937499999999999 | 0 |
| 0.8944444444444444 | 0 |
| 0.8951388888888889 | 0 |
| 0.8958333333333334 | 0 |
| 0.8965277777777777 | 0 |
| 0.8972222222222223 | 0 |
| 0.8979166666666667 | 0 |
| 0.8986111111111111 | 0 |
| 0.8993055555555555 | 0 |
| 0.9 | 0 |
| 0.9006944444444445 | 0 |
| 0.9013888888888889 | 0 |
| 0.9020833333333332 | 0 |
| 0.9027777777777778 | 0 |
| 0.9034722222222222 | 0 |
| 0.9041666666666667 | 0 |
| 0.904861111111111 | 0 |
| 0.9055555555555556 | 0 |
| 0.90625 | 0 |
| 0.9069444444444444 | 0 |
| 0.907638888888889 | 0 |
| 0.9083333333333333 | 0 |
| 0.9090277777777778 | 0 |
| 0.9097222222222222 | 0 |
| 0.9104166666666668 | 0 |
| 0.9111111111111111 | 0 |
| 0.9118055555555555 | 0 |
| 0.9125 | 0 |
| 0.9131944444444445 | 0 |
| 0.9138888888888889 | 0 |
| 0.9145833333333333 | 0 |
| 0.9152777777777777 | 0 |
| 0.9159722222222223 | 0 |
| 0.9166666666666666 | 0 |
| 0.9173611111111111 | 0 |
| 0.9180555555555556 | 0 |
| 0.9187500000000001 | 0 |
| 0.9194444444444444 | 0 |
| 0.9201388888888888 | 0 |
| 0.9208333333333334 | 0 |
| 0.9215277777777778 | 0 |
| 0.9222222222222222 | 0 |
| 0.9229166666666666 | 0 |
| 0.9236111111111112 | 0 |
| 0.9243055555555556 | 0 |
| 0.9249999999999999 | 0 |
| 0.9256944444444444 | 0 |
| 0.9263888888888889 | 0 |
| 0.9270833333333334 | 0 |
| 0.9277777777777777 | 0 |
| 0.9284722222222223 | 0 |
| 0.9291666666666667 | 0 |
| 0.9298611111111111 | 0 |
| 0.9305555555555555 | 0 |
| 0.93125 | 0 |
| 0.9319444444444445 | 0 |
| 0.9326388888888889 | 0 |
| 0.9333333333333332 | 0 |
| 0.9340277777777778 | 0 |
| 0.9347222222222222 | 0 |
| 0.9354166666666667 | 0 |
| 0.936111111111111 | 0 |
| 0.9368055555555556 | 0 |
| 0.9375 | 0 |
| 0.9381944444444444 | 0 |
| 0.938888888888889 | 0 |
| 0.9395833333333333 | 0 |
| 0.9402777777777778 | 0 |
| 0.9409722222222222 | 0 |
| 0.9416666666666668 | 0 |
| 0.9423611111111111 | 0 |
| 0.9430555555555555 | 0 |
| 0.94375 | 0 |
| 0.9444444444444445 | 0 |
| 0.9451388888888889 | 0 |
| 0.9458333333333333 | 0 |
| 0.9465277777777777 | 0 |
| 0.9472222222222223 | 0 |
| 0.9479166666666666 | 0 |
| 0.9486111111111111 | 0 |
| 0.9493055555555556 | 0 |
| 0.9500000000000001 | 0 |
| 0.9506944444444444 | 0 |
| 0.9513888888888888 | 0 |
| 0.9520833333333334 | 0 |
| 0.9527777777777778 | 0 |
| 0.9534722222222222 | 0 |
| 0.9541666666666666 | 0 |
| 0.9548611111111112 | 0 |
| 0.9555555555555556 | 0 |
| 0.9562499999999999 | 0 |
| 0.9569444444444444 | 0 |
| 0.9576388888888889 | 0 |
| 0.9583333333333334 | 0 |
| 0.9590277777777777 | 0 |
| 0.9597222222222223 | 0 |
| 0.9604166666666667 | 0 |
| 0.9611111111111111 | 0 |
| 0.9618055555555555 | 0 |
| 0.9625 | 0 |
| 0.9631944444444445 | 0 |
| 0.9638888888888889 | 0 |
| 0.9645833333333332 | 0 |
| 0.9652777777777778 | 0 |
| 0.9659722222222222 | 0 |
| 0.9666666666666667 | 0 |
| 0.967361111111111 | 0 |
| 0.9680555555555556 | 0 |
| 0.96875 | 0 |
| 0.9694444444444444 | 0 |
| 0.970138888888889 | 0 |
| 0.9708333333333333 | 0 |
| 0.9715277777777778 | 0 |
| 0.9722222222222222 | 0 |
| 0.9729166666666668 | 0 |
| 0.9736111111111111 | 0 |
| 0.9743055555555555 | 0 |
| 0.975 | 0 |
| 0.9756944444444445 | 0 |
| 0.9763888888888889 | 0 |
| 0.9770833333333333 | 0 |
| 0.9777777777777777 | 0 |
| 0.9784722222222223 | 0 |
| 0.9791666666666666 | 0 |
| 0.9798611111111111 | 0 |
| 0.9805555555555556 | 0 |
| 0.9812500000000001 | 0 |
| 0.9819444444444444 | 0 |
| 0.9826388888888888 | 0 |
| 0.9833333333333334 | 0 |
| 0.9840277777777778 | 0 |
| 0.9847222222222222 | 0 |
| 0.9854166666666666 | 0 |
| 0.9861111111111112 | 0 |
| 0.9868055555555556 | 0 |
| 0.9874999999999999 | 0 |
| 0.9881944444444444 | 0 |
| 0.9888888888888889 | 0 |
| 0.9895833333333334 | 0 |
| 0.9902777777777777 | 0 |
| 0.9909722222222223 | 0 |
| 0.9916666666666667 | 0 |
| 0.9923611111111111 | 0 |
| 0.9930555555555555 | 0 |
| 0.99375 | 0 |
| 0.9944444444444445 | 0 |
| 0.9951388888888889 | 0 |
| 0.9958333333333332 | 0 |
| 0.9965277777777778 | 0 |
| 0.9972222222222222 | 0 |
| 0.9979166666666667 | 0 |
| 0.998611111111111 | 0 |
| 0.9993055555555556 | 0 |